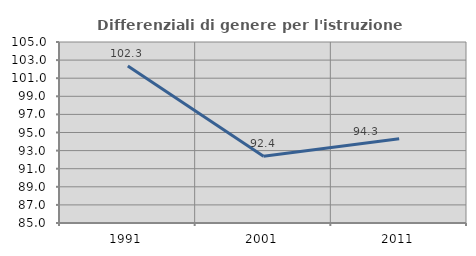
| Category | Differenziali di genere per l'istruzione superiore |
|---|---|
| 1991.0 | 102.345 |
| 2001.0 | 92.378 |
| 2011.0 | 94.307 |